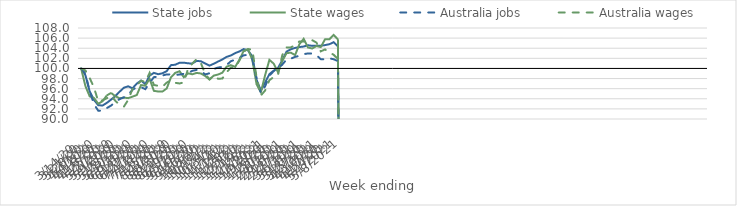
| Category | State jobs | State wages | Australia jobs | Australia wages |
|---|---|---|---|---|
| 14/03/2020 | 100 | 100 | 100 | 100 |
| 21/03/2020 | 98.66 | 96.498 | 98.971 | 99.603 |
| 28/03/2020 | 95.439 | 94.476 | 95.467 | 98.105 |
| 04/04/2020 | 93.773 | 94.163 | 92.92 | 96.234 |
| 11/04/2020 | 92.732 | 93.018 | 91.647 | 93.487 |
| 18/04/2020 | 92.66 | 93.507 | 91.63 | 93.692 |
| 25/04/2020 | 93.19 | 94.666 | 92.16 | 94.108 |
| 02/05/2020 | 93.829 | 95.16 | 92.657 | 94.655 |
| 09/05/2020 | 94.548 | 94.493 | 93.343 | 93.578 |
| 16/05/2020 | 95.409 | 94.102 | 93.935 | 92.812 |
| 23/05/2020 | 96.19 | 94.231 | 94.291 | 92.462 |
| 30/05/2020 | 96.465 | 94.127 | 94.798 | 93.79 |
| 06/06/2020 | 96.07 | 94.426 | 95.781 | 95.926 |
| 13/06/2020 | 96.998 | 94.733 | 96.28 | 96.602 |
| 20/06/2020 | 97.6 | 96.716 | 96.296 | 97.58 |
| 27/06/2020 | 96.9 | 96.581 | 95.902 | 97.326 |
| 04/07/2020 | 98.581 | 97.934 | 97.157 | 99.113 |
| 11/07/2020 | 99.124 | 95.571 | 98.279 | 96.733 |
| 18/07/2020 | 98.861 | 95.439 | 98.382 | 96.561 |
| 25/07/2020 | 99.044 | 95.426 | 98.604 | 96.362 |
| 01/08/2020 | 99.476 | 96.041 | 98.826 | 97.197 |
| 08/08/2020 | 100.655 | 98.263 | 98.822 | 97.652 |
| 15/08/2020 | 100.735 | 99.124 | 98.73 | 97.16 |
| 22/08/2020 | 101.132 | 99.452 | 98.792 | 97.027 |
| 29/08/2020 | 101.151 | 98.263 | 98.928 | 97.246 |
| 05/09/2020 | 101.004 | 99.041 | 99.113 | 99.964 |
| 12/09/2020 | 100.999 | 98.844 | 99.531 | 100.967 |
| 19/09/2020 | 101.492 | 99.116 | 99.714 | 101.852 |
| 26/09/2020 | 101.419 | 98.999 | 99.52 | 101.02 |
| 03/10/2020 | 100.973 | 98.5 | 98.806 | 98.883 |
| 10/10/2020 | 100.56 | 97.797 | 99.055 | 97.873 |
| 17/10/2020 | 100.93 | 98.585 | 99.899 | 98.568 |
| 24/10/2020 | 101.369 | 98.798 | 100.18 | 97.964 |
| 31/10/2020 | 101.779 | 99.157 | 100.306 | 97.998 |
| 07/11/2020 | 102.293 | 100.359 | 100.68 | 99.252 |
| 14/11/2020 | 102.565 | 100.649 | 101.424 | 100.173 |
| 21/11/2020 | 103.036 | 100.31 | 101.745 | 100.229 |
| 28/11/2020 | 103.366 | 101.754 | 102.059 | 101.576 |
| 05/12/2020 | 103.833 | 103.482 | 102.608 | 103.362 |
| 12/12/2020 | 103.561 | 103.789 | 102.679 | 103.837 |
| 19/12/2020 | 102.394 | 101.702 | 101.871 | 103.708 |
| 26/12/2020 | 97.758 | 96.865 | 98.073 | 98.239 |
| 02/01/2021 | 95.612 | 95.285 | 95.142 | 94.651 |
| 09/01/2021 | 97.223 | 98.699 | 96.464 | 95.644 |
| 16/01/2021 | 98.877 | 101.694 | 98.546 | 97.678 |
| 23/01/2021 | 99.557 | 100.944 | 99.493 | 98.293 |
| 30/01/2021 | 100.076 | 99.276 | 99.995 | 98.662 |
| 06/02/2021 | 101.612 | 101.46 | 100.749 | 102.61 |
| 13/02/2021 | 103.332 | 103.014 | 101.78 | 104.166 |
| 20/02/2021 | 103.786 | 103.125 | 101.937 | 104.163 |
| 27/02/2021 | 104.059 | 102.641 | 102.282 | 104.593 |
| 06/03/2021 | 104.234 | 104.776 | 102.496 | 105.335 |
| 13/03/2021 | 104.332 | 105.856 | 102.825 | 105.317 |
| 20/03/2021 | 104.595 | 104.148 | 102.964 | 105.281 |
| 27/03/2021 | 104.464 | 103.945 | 102.951 | 105.588 |
| 03/04/2021 | 104.472 | 104.439 | 102.614 | 105.117 |
| 10/04/2021 | 104.486 | 104.228 | 101.84 | 103.377 |
| 17/04/2021 | 104.616 | 105.76 | 101.797 | 103.762 |
| 24/04/2021 | 104.784 | 105.753 | 102 | 103.175 |
| 01/05/2021 | 105.19 | 106.63 | 101.825 | 102.713 |
| 08/05/2021 | 104.407 | 105.761 | 101.453 | 101.885 |